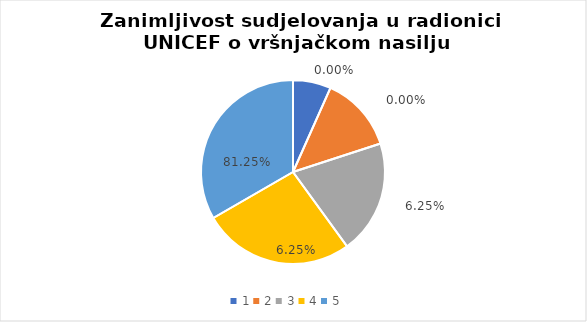
| Category | Series 0 | Series 1 |
|---|---|---|
| 0 | 1 | 0 |
| 1 | 2 | 0 |
| 2 | 3 | 0.062 |
| 3 | 4 | 0.062 |
| 4 | 5 | 0.812 |